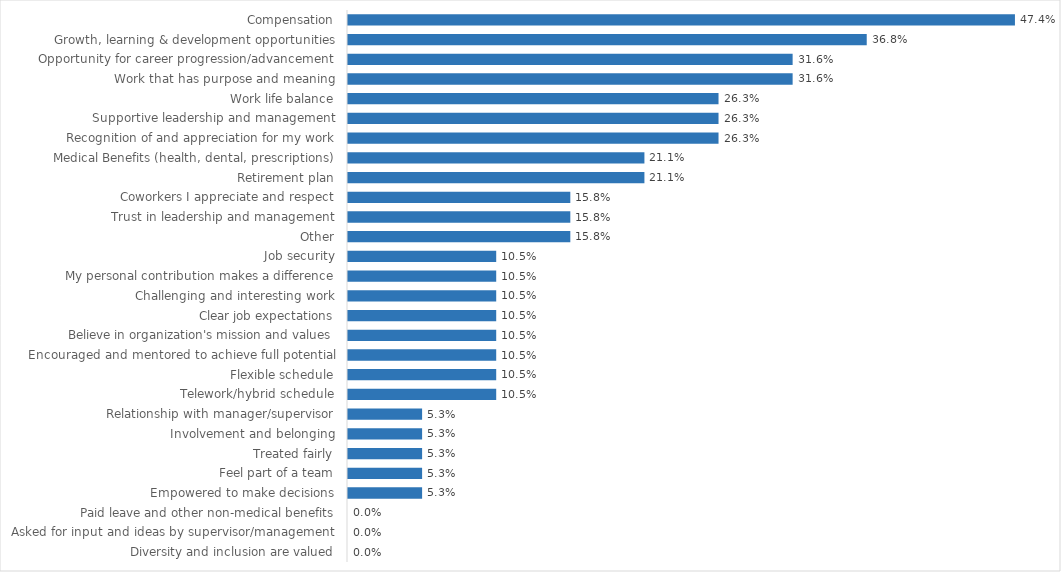
| Category | Natural Resources Board |
|---|---|
| Compensation | 0.474 |
| Growth, learning & development opportunities | 0.368 |
| Opportunity for career progression/advancement | 0.316 |
| Work that has purpose and meaning | 0.316 |
| Work life balance | 0.263 |
| Supportive leadership and management | 0.263 |
| Recognition of and appreciation for my work | 0.263 |
| Medical Benefits (health, dental, prescriptions) | 0.211 |
| Retirement plan | 0.211 |
| Coworkers I appreciate and respect | 0.158 |
| Trust in leadership and management | 0.158 |
| Other | 0.158 |
| Job security | 0.105 |
| My personal contribution makes a difference | 0.105 |
| Challenging and interesting work | 0.105 |
| Clear job expectations | 0.105 |
| Believe in organization's mission and values | 0.105 |
| Encouraged and mentored to achieve full potential | 0.105 |
| Flexible schedule | 0.105 |
| Telework/hybrid schedule | 0.105 |
| Relationship with manager/supervisor | 0.053 |
| Involvement and belonging | 0.053 |
| Treated fairly | 0.053 |
| Feel part of a team | 0.053 |
| Empowered to make decisions | 0.053 |
| Paid leave and other non-medical benefits | 0 |
| Asked for input and ideas by supervisor/management | 0 |
| Diversity and inclusion are valued | 0 |